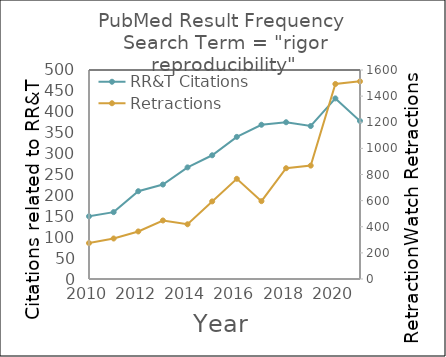
| Category | RR&T Citations |
|---|---|
| 2021.0 | 378 |
| 2020.0 | 432 |
| 2019.0 | 366 |
| 2018.0 | 375 |
| 2017.0 | 369 |
| 2016.0 | 340 |
| 2015.0 | 296 |
| 2014.0 | 267 |
| 2013.0 | 226 |
| 2012.0 | 210 |
| 2011.0 | 160 |
| 2010.0 | 150 |